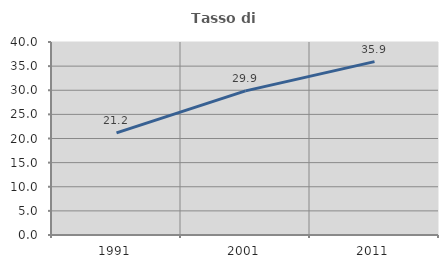
| Category | Tasso di occupazione   |
|---|---|
| 1991.0 | 21.167 |
| 2001.0 | 29.864 |
| 2011.0 | 35.927 |